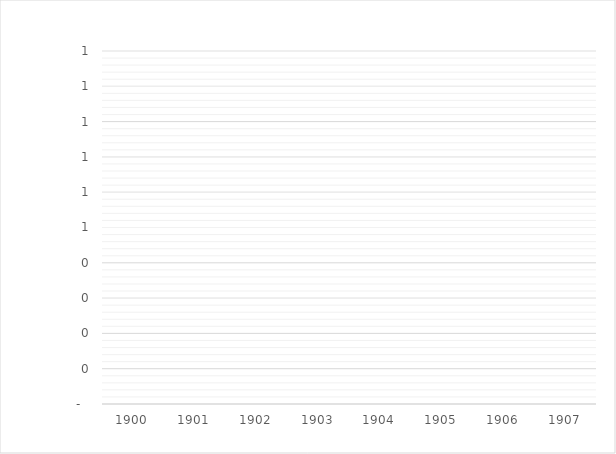
| Category | 1 | 2 | 3 | 4 | 5 | 6 | 7 | 8 | 9 | 10 | 11 | 12 | 13 | 14 | 15 |
|---|---|---|---|---|---|---|---|---|---|---|---|---|---|---|---|
| 1900.0 | 0 | 0 | 0 | 0 | 0 | 0 | 0 | 0 | 0 | 0 | 0 | 0 | 0 | 0 | 0 |
| 1901.0 | 0 | 0 | 0 | 0 | 0 | 0 | 0 | 0 | 0 | 0 | 0 | 0 | 0 | 0 | 0 |
| 1902.0 | 0 | 0 | 0 | 0 | 0 | 0 | 0 | 0 | 0 | 0 | 0 | 0 | 0 | 0 | 0 |
| 1903.0 | 0 | 0 | 0 | 0 | 0 | 0 | 0 | 0 | 0 | 0 | 0 | 0 | 0 | 0 | 0 |
| 1904.0 | 0 | 0 | 0 | 0 | 0 | 0 | 0 | 0 | 0 | 0 | 0 | 0 | 0 | 0 | 0 |
| 1905.0 | 0 | 0 | 0 | 0 | 0 | 0 | 0 | 0 | 0 | 0 | 0 | 0 | 0 | 0 | 0 |
| 1906.0 | 0 | 0 | 0 | 0 | 0 | 0 | 0 | 0 | 0 | 0 | 0 | 0 | 0 | 0 | 0 |
| 1907.0 | 0 | 0 | 0 | 0 | 0 | 0 | 0 | 0 | 0 | 0 | 0 | 0 | 0 | 0 | 0 |